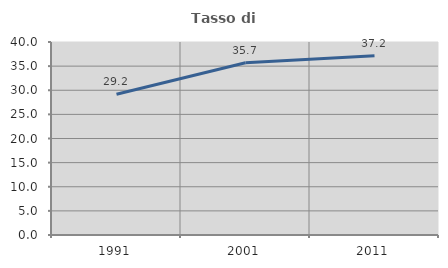
| Category | Tasso di occupazione   |
|---|---|
| 1991.0 | 29.177 |
| 2001.0 | 35.689 |
| 2011.0 | 37.153 |